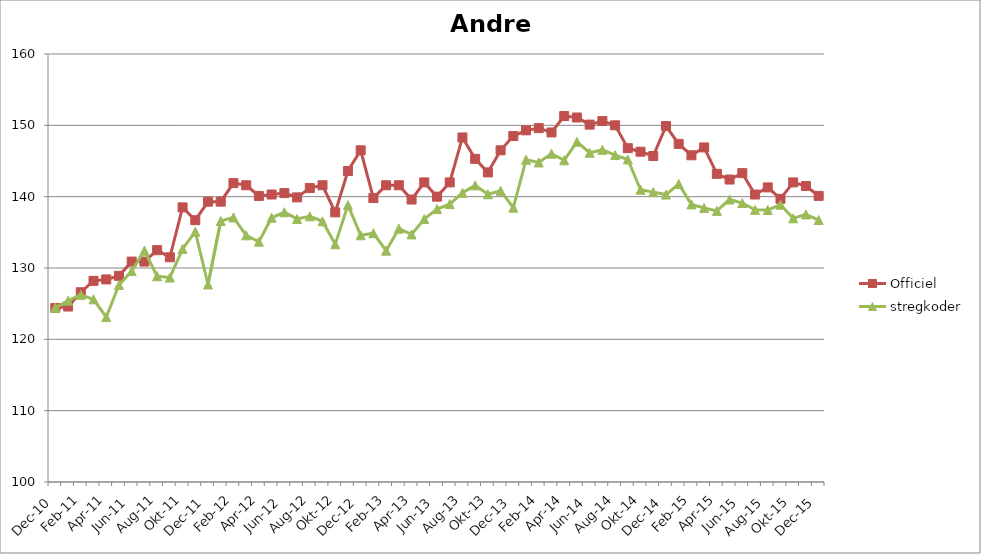
| Category | Officiel | stregkoder |
|---|---|---|
|  Dec-10 | 124.4 | 124.418 |
|  Jan-11 | 124.6 | 125.421 |
|  Feb-11 | 126.6 | 126.236 |
|  Mar-11 | 128.2 | 125.609 |
|  Apr-11 | 128.4 | 123.115 |
|  Maj-11 | 128.9 | 127.608 |
|  Jun-11 | 130.9 | 129.566 |
|  Jul-11 | 130.9 | 132.433 |
|  Aug-11 | 132.5 | 128.85 |
|  Sep-11 | 131.5 | 128.659 |
|  Okt-11 | 138.5 | 132.673 |
|  Nov-11 | 136.7 | 135.086 |
|  Dec-11 | 139.3 | 127.686 |
|  Jan-12 | 139.3 | 136.582 |
|  Feb-12 | 141.9 | 137.089 |
|  Mar-12 | 141.6 | 134.586 |
|  Apr-12 | 140.1 | 133.683 |
|  Maj-12 | 140.3 | 137.044 |
|  Jun-12 | 140.5 | 137.811 |
|  Jul-12 | 139.9 | 136.877 |
|  Aug-12 | 141.2 | 137.242 |
|  Sep-12 | 141.6 | 136.544 |
|  Okt-12 | 137.8 | 133.322 |
|  Nov-12 | 143.6 | 138.816 |
|  Dec-12 | 146.5 | 134.584 |
|  Jan-13 | 139.8 | 134.876 |
|  Feb-13 | 141.6 | 132.427 |
|  Mar-13 | 141.6 | 135.51 |
|  Apr-13 | 139.6 | 134.708 |
|  Maj-13 | 142 | 136.867 |
|  Jun-13 | 140 | 138.26 |
|  Jul-13 | 142 | 138.956 |
|  Aug-13 | 148.3 | 140.538 |
|  Sep-13 | 145.3 | 141.589 |
|  Okt-13 | 143.4 | 140.334 |
|  Nov-13 | 146.5 | 140.821 |
|  Dec-13 | 148.5 | 138.459 |
|  Jan-14 | 149.3 | 145.178 |
|  Feb-14 | 149.6 | 144.798 |
|  Mar-14 | 149 | 146.023 |
|  Apr-14 | 151.3 | 145.094 |
|  Maj-14 | 151.1 | 147.694 |
|  Jun-14 | 150.1 | 146.155 |
|  Jul-14 | 150.6 | 146.567 |
|  Aug-14 | 150 | 145.833 |
|  Sep-14 | 146.8 | 145.214 |
|  Okt-14 | 146.3 | 140.97 |
|  Nov-14 | 145.7 | 140.634 |
|  Dec-14 | 149.9 | 140.297 |
|  Jan-15 | 147.4 | 141.778 |
|  Feb-15 | 145.8 | 138.914 |
|  Mar-15 | 146.9 | 138.416 |
|  Apr-15 | 143.2 | 137.997 |
|  Maj-15 | 142.4 | 139.602 |
| Jun-15 | 143.3 | 139.106 |
| Jul-15 | 140.3 | 138.152 |
| Aug-15 | 141.3 | 138.13 |
| Sep-15 | 139.7 | 138.865 |
| Okt-15 | 142 | 136.959 |
| Nov-15 | 141.5 | 137.515 |
| Dec-15 | 140.108 | 136.722 |